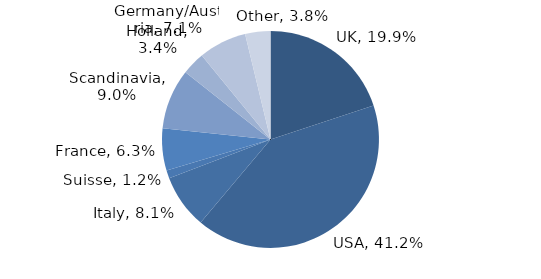
| Category | Investment Style |
|---|---|
| UK | 0.199 |
| USA | 0.412 |
| Italy | 0.081 |
| Suisse | 0.012 |
| France | 0.063 |
| Scandinavia | 0.09 |
| Holland | 0.034 |
| Germany/Austria | 0.071 |
| Other | 0.038 |